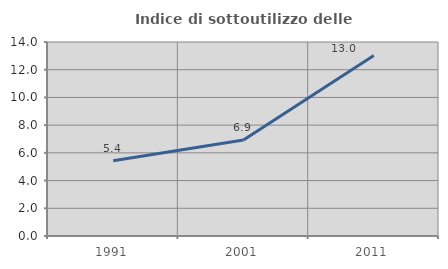
| Category | Indice di sottoutilizzo delle abitazioni  |
|---|---|
| 1991.0 | 5.431 |
| 2001.0 | 6.925 |
| 2011.0 | 13.03 |